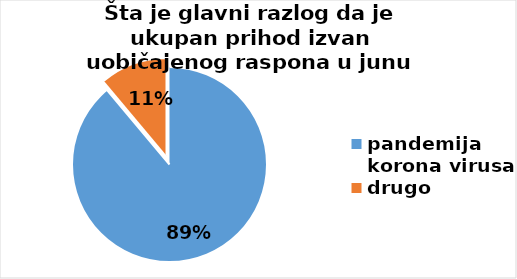
| Category | Series 0 |
|---|---|
| pandemija korona virusa | 304 |
| drugo | 38 |